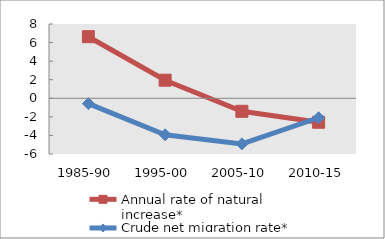
| Category | Annual rate of natural increase* | Crude net migration rate* |
|---|---|---|
| 1985-90 | 6.631 | -0.573 |
| 1995-00 | 1.947 | -3.93 |
| 2005-10 | -1.4 | -4.91 |
| 2010-15 | -2.581 | -2.097 |